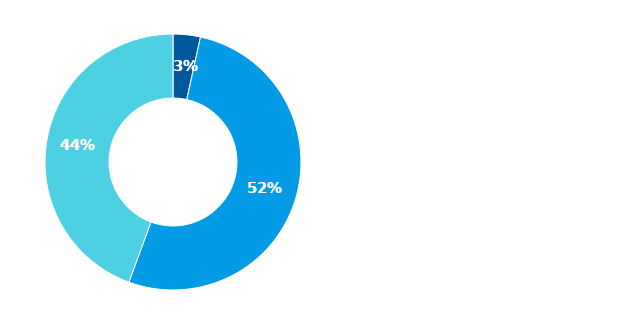
| Category | Series 0 |
|---|---|
| Hotovost | 0.034 |
| Půjčky poskytnuté nemovitostní společnosti | 0.522 |
| Majetkové účasti v nemovitostní společnosti | 0.444 |
| Ostatní finanční aktiva | 0 |